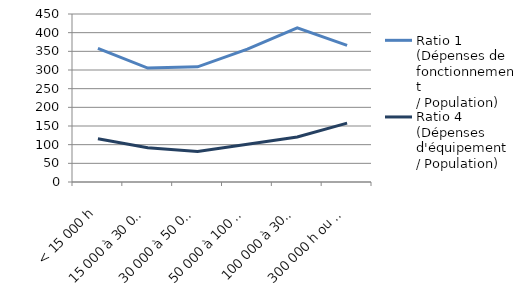
| Category | Ratio 1 
(Dépenses de fonctionnement 
/ Population) | Ratio 4 
(Dépenses d'équipement 
/ Population) |
|---|---|---|
| < 15 000 h | 357.933 | 115.836 |
| 15 000 à 30 000 h | 305.22 | 91.783 |
| 30 000 à 50 000 h | 308.583 | 81.707 |
| 50 000 à 100 000 h | 355.694 | 101.388 |
| 100 000 à 300 000 h | 413.149 | 120.491 |
| 300 000 h ou plus | 366.01 | 157.753 |